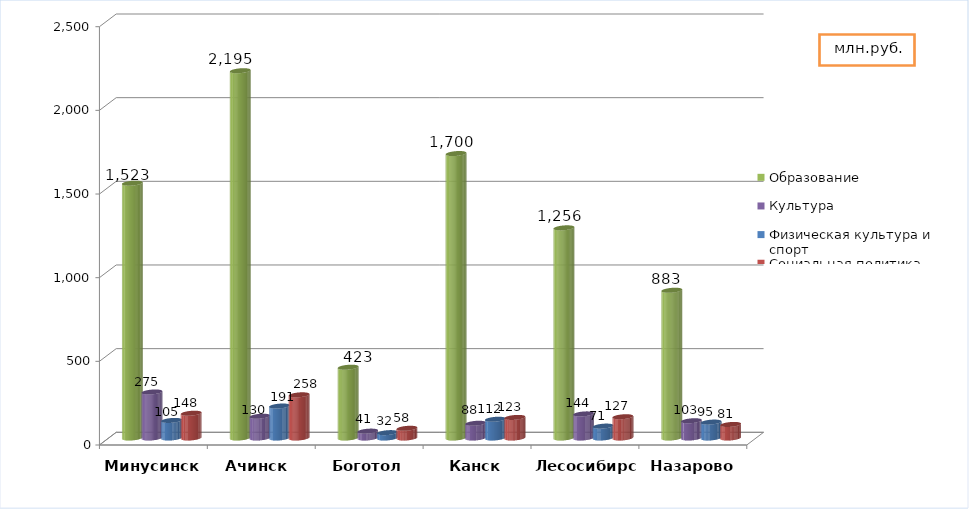
| Category | Образование | Культура | Физическая культура и спорт | Социальная политика |
|---|---|---|---|---|
| Минусинск | 1523 | 275 | 105 | 148 |
| Ачинск  | 2195 | 130 | 191 | 258 |
| Боготол | 423 | 41 | 32 | 58 |
| Канск | 1700 | 88 | 112 | 123 |
| Лесосибирск | 1256 | 144 | 71 | 127 |
| Назарово | 883 | 103 | 95 | 81 |